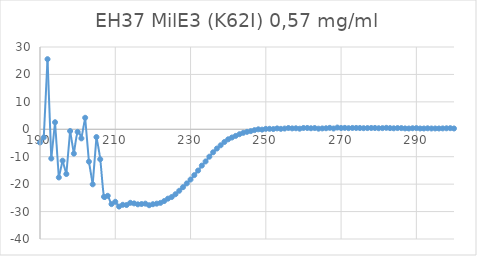
| Category | Series 0 |
|---|---|
| 300.0 | 0.293 |
| 299.0 | 0.401 |
| 298.0 | 0.361 |
| 297.0 | 0.324 |
| 296.0 | 0.293 |
| 295.0 | 0.299 |
| 294.0 | 0.294 |
| 293.0 | 0.361 |
| 292.0 | 0.291 |
| 291.0 | 0.294 |
| 290.0 | 0.426 |
| 289.0 | 0.384 |
| 288.0 | 0.291 |
| 287.0 | 0.319 |
| 286.0 | 0.429 |
| 285.0 | 0.446 |
| 284.0 | 0.357 |
| 283.0 | 0.423 |
| 282.0 | 0.53 |
| 281.0 | 0.422 |
| 280.0 | 0.386 |
| 279.0 | 0.472 |
| 278.0 | 0.474 |
| 277.0 | 0.446 |
| 276.0 | 0.399 |
| 275.0 | 0.458 |
| 274.0 | 0.48 |
| 273.0 | 0.483 |
| 272.0 | 0.404 |
| 271.0 | 0.517 |
| 270.0 | 0.464 |
| 269.0 | 0.632 |
| 268.0 | 0.286 |
| 267.0 | 0.523 |
| 266.0 | 0.373 |
| 265.0 | 0.315 |
| 264.0 | 0.228 |
| 263.0 | 0.45 |
| 262.0 | 0.37 |
| 261.0 | 0.479 |
| 260.0 | 0.474 |
| 259.0 | 0.219 |
| 258.0 | 0.364 |
| 257.0 | 0.325 |
| 256.0 | 0.462 |
| 255.0 | 0.273 |
| 254.0 | 0.166 |
| 253.0 | 0.322 |
| 252.0 | 0.096 |
| 251.0 | 0.179 |
| 250.0 | 0.145 |
| 249.0 | -0.121 |
| 248.0 | -0.01 |
| 247.0 | -0.298 |
| 246.0 | -0.667 |
| 245.0 | -0.929 |
| 244.0 | -1.286 |
| 243.0 | -1.795 |
| 242.0 | -2.41 |
| 241.0 | -2.997 |
| 240.0 | -3.651 |
| 239.0 | -4.64 |
| 238.0 | -5.836 |
| 237.0 | -7.019 |
| 236.0 | -8.385 |
| 235.0 | -9.989 |
| 234.0 | -11.726 |
| 233.0 | -13.244 |
| 232.0 | -15.049 |
| 231.0 | -16.71 |
| 230.0 | -18.32 |
| 229.0 | -19.736 |
| 228.0 | -21.103 |
| 227.0 | -22.414 |
| 226.0 | -23.674 |
| 225.0 | -24.694 |
| 224.0 | -25.29 |
| 223.0 | -26.166 |
| 222.0 | -26.834 |
| 221.0 | -27.114 |
| 220.0 | -27.322 |
| 219.0 | -27.689 |
| 218.0 | -27.112 |
| 217.0 | -27.247 |
| 216.0 | -27.358 |
| 215.0 | -27.026 |
| 214.0 | -26.81 |
| 213.0 | -27.611 |
| 212.0 | -27.528 |
| 211.0 | -28.174 |
| 210.0 | -26.427 |
| 209.0 | -27.28 |
| 208.0 | -24.254 |
| 207.0 | -24.625 |
| 206.0 | -10.927 |
| 205.0 | -2.834 |
| 204.0 | -20.071 |
| 203.0 | -11.799 |
| 202.0 | 4.196 |
| 201.0 | -3.319 |
| 200.0 | -0.938 |
| 199.0 | -8.876 |
| 198.0 | -0.639 |
| 197.0 | -16.311 |
| 196.0 | -11.446 |
| 195.0 | -17.561 |
| 194.0 | 2.563 |
| 193.0 | -10.649 |
| 192.0 | 25.562 |
| 191.0 | -2.976 |
| 190.0 | -4.848 |